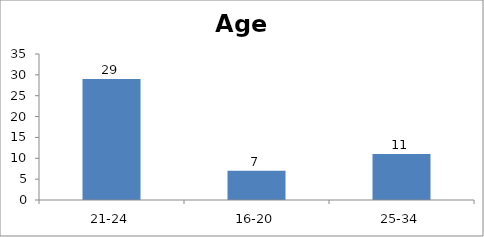
| Category | Age |
|---|---|
| 21-24 | 29 |
| 16-20 | 7 |
| 25-34 | 11 |